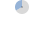
| Category | Datos | Series 9 | Series 10 | Series 11 | Series 12 | Series 13 | Series 14 | Series 15 | Series 5 | Series 6 | Series 7 | Series 3 | Series 1 |
|---|---|---|---|---|---|---|---|---|---|---|---|---|---|
| no | 125 | 125 | 125 | 125 | 125 | 125 | 125 | 125 | 125 | 125 | 125 | 125 | 125 |
| si | 450 | 450 | 450 | 450 | 450 | 450 | 450 | 450 | 450 | 450 | 450 | 450 | 450 |